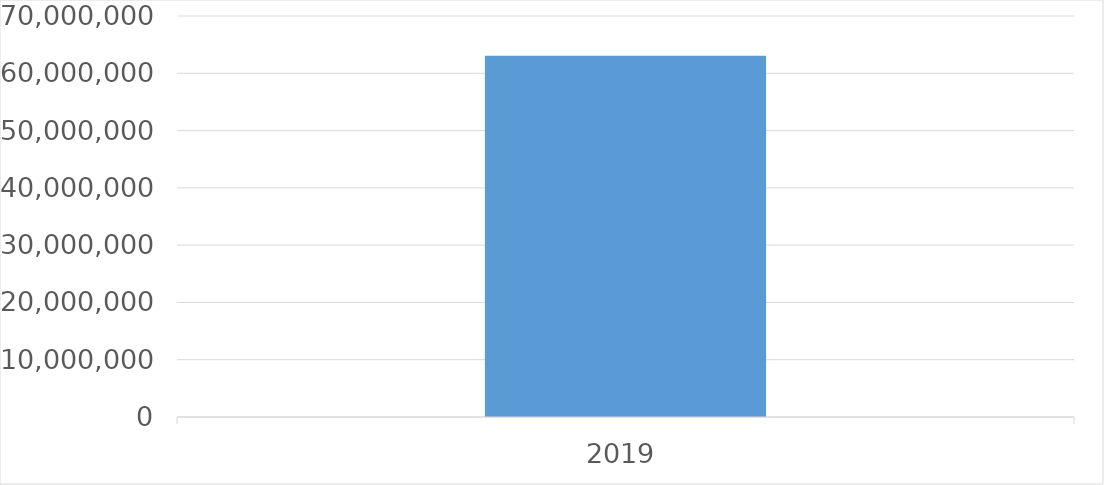
| Category | Series 0 |
|---|---|
| 2019 | 63075063 |